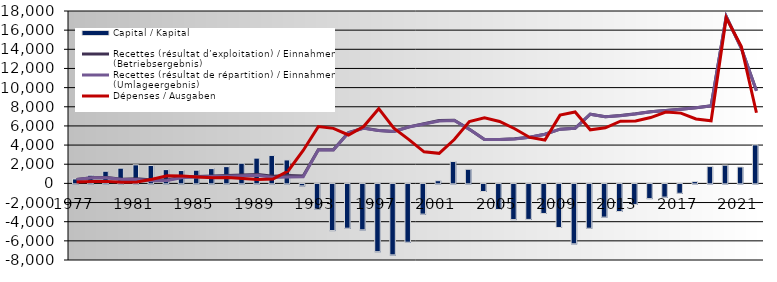
| Category | Capital / Kapital |
|---|---|
| 1977.0 | 464.483 |
| 1978.0 | 854.748 |
| 1979.0 | 1271.164 |
| 1980.0 | 1591.625 |
| 1981.0 | 1934.535 |
| 1982.0 | 1871.18 |
| 1983.0 | 1438.016 |
| 1984.0 | 1341.357 |
| 1985.0 | 1378.515 |
| 1986.0 | 1543.582 |
| 1987.0 | 1749.103 |
| 1988.0 | 2105.6 |
| 1989.0 | 2639.747 |
| 1990.0 | 2923.665 |
| 1991.0 | 2449.919 |
| 1992.0 | -207.185 |
| 1993.0 | -2636.648 |
| 1994.0 | -4877.96 |
| 1995.0 | -4630.682 |
| 1996.0 | -4799.087 |
| 1997.0 | -7082.2 |
| 1998.0 | -7415.1 |
| 1999.0 | -6092.5 |
| 2000.0 | -3157.2 |
| 2001.0 | 279.4 |
| 2002.0 | 2282.9 |
| 2003.0 | 1475 |
| 2004.0 | -796.9 |
| 2005.0 | -2675.2 |
| 2006.0 | -3729.5 |
| 2007.0 | -3708 |
| 2008.0 | -3090.299 |
| 2009.0 | -4554.092 |
| 2010.0 | -6259.15 |
| 2011.0 | -4631.699 |
| 2012.0 | -3473.793 |
| 2013.0 | -2886.49 |
| 2014.0 | -2149.169 |
| 2015.0 | -1539.311 |
| 2016.0 | -1383.776 |
| 2017.0 | -982.388 |
| 2018.0 | 190.923 |
| 2019.0 | 1754.933 |
| 2020.0 | 1899.704 |
| 2021.0 | 1713.917 |
| 2022.0 | 4020.572 |